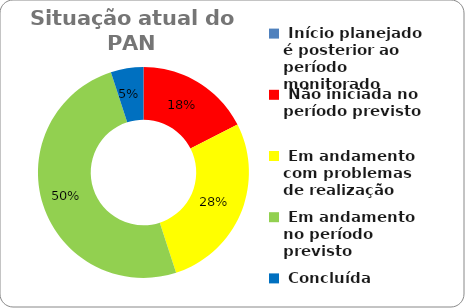
| Category | Series 0 |
|---|---|
|  Início planejado é posterior ao período monitorado | 0 |
|  Não iniciada no período previsto | 0.175 |
|  Em andamento com problemas de realização | 0.275 |
|  Em andamento no período previsto  | 0.5 |
|  Concluída | 0.05 |